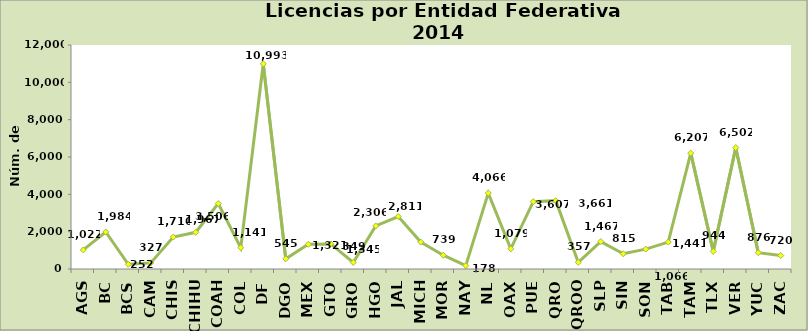
| Category | Series 0 |
|---|---|
| AGS | 1022 |
| BC | 1984 |
| BCS | 252 |
| CAM | 327 |
| CHIS | 1710 |
| CHIHU | 1967 |
| COAH | 3506 |
| COL | 1141 |
| DF | 10993 |
| DGO | 545 |
| MEX | 1321 |
| GTO | 1345 |
| GRO | 349 |
| HGO | 2306 |
| JAL | 2811 |
| MICH | 1444 |
| MOR | 739 |
| NAY | 178 |
| NL | 4066 |
| OAX | 1079 |
| PUE | 3607 |
| QRO | 3661 |
| QROO | 357 |
| SLP | 1467 |
| SIN | 815 |
| SON | 1066 |
| TAB | 1441 |
| TAM | 6207 |
| TLX | 944 |
| VER | 6502 |
| YUC | 876 |
| ZAC | 720 |